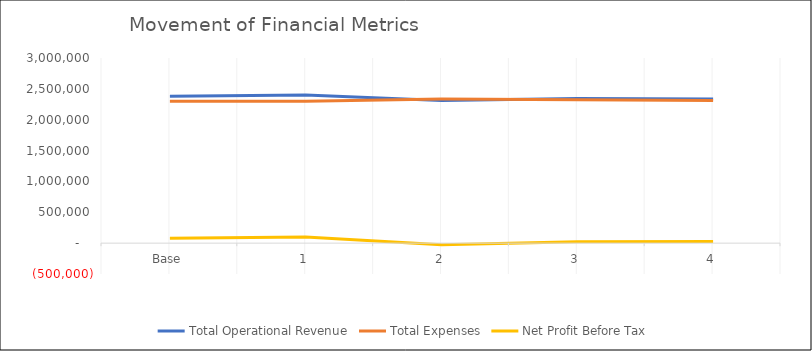
| Category |  Total Operational Revenue  |  Total Expenses  |  Net Profit Before Tax  |
|---|---|---|---|
| Base | 2380000 | 2300000 | 80000 |
| 1 | 2401293.326 | 2300000 | 101293.326 |
| 2 | 2309649.038 | 2333764.002 | -24114.964 |
| 3 | 2344689.246 | 2321512.134 | 23177.112 |
| 4 | 2336193.46 | 2309454.121 | 26739.339 |